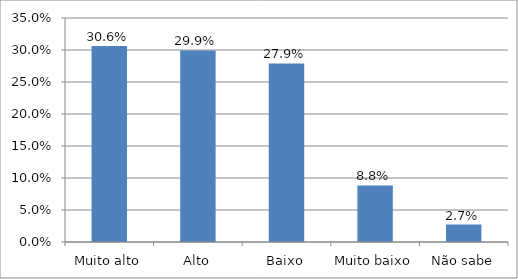
| Category | Series 0 |
|---|---|
| Muito alto | 0.306 |
| Alto | 0.299 |
| Baixo | 0.279 |
| Muito baixo | 0.088 |
| Não sabe | 0.027 |